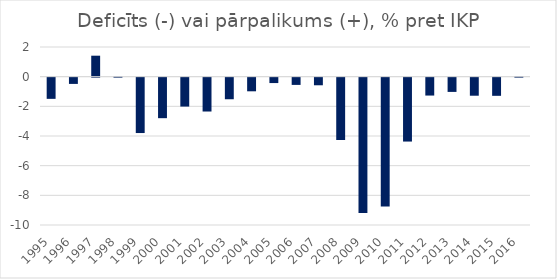
| Category | Deficīts (-) vai pārpalikums (+), % pret IKP |
|---|---|
| 1995 | -1.428 |
| 1996 | -0.421 |
| 1997 | 1.414 |
| 1998 | 0.029 |
| 1999 | -3.733 |
| 2000 | -2.731 |
| 2001 | -1.948 |
| 2002 | -2.282 |
| 2003 | -1.455 |
| 2004 | -0.919 |
| 2005 | -0.364 |
| 2006 | -0.488 |
| 2007 | -0.513 |
| 2008 | -4.204 |
| 2009 | -9.127 |
| 2010 | -8.686 |
| 2011 | -4.307 |
| 2012 | -1.206 |
| 2013 | -0.96 |
| 2014 | -1.217 |
| 2015 | -1.224 |
| 2016 | 0.038 |